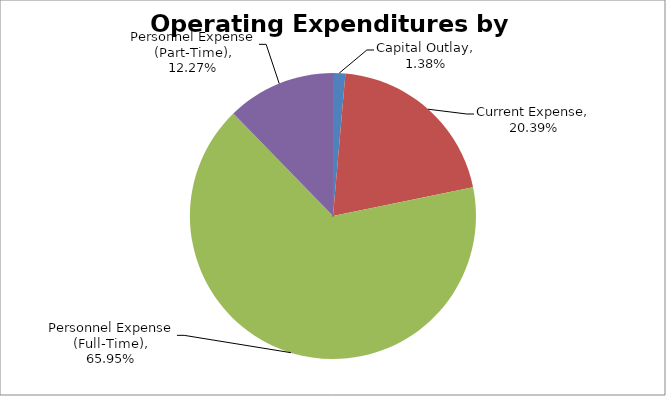
| Category | Series 0 |
|---|---|
| Capital Outlay | 0.014 |
| Current Expense | 0.204 |
| Personnel Expense (Full-Time) | 0.659 |
| Personnel Expense (Part-Time) | 0.123 |